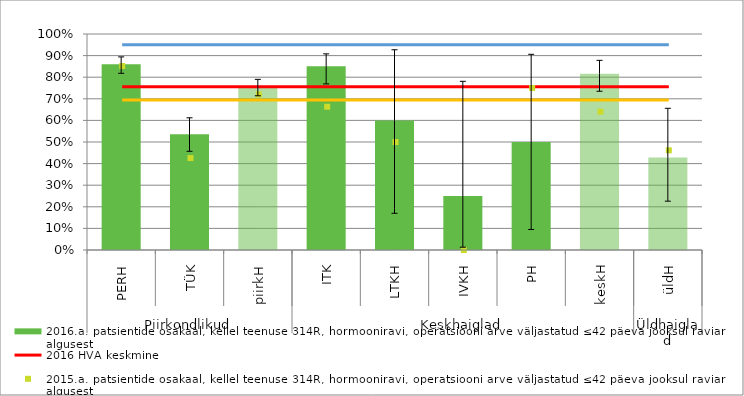
| Category | 2016.a. patsientide osakaal, kellel teenuse 314R, hormooniravi, operatsiooni arve väljastatud ≤42 päeva jooksul raviarve algusest |
|---|---|
| 0 | 0.86 |
| 1 | 0.536 |
| 2 | 0.754 |
| 3 | 0.851 |
| 4 | 0.6 |
| 5 | 0.25 |
| 6 | 0.5 |
| 7 | 0.816 |
| 8 | 0.429 |